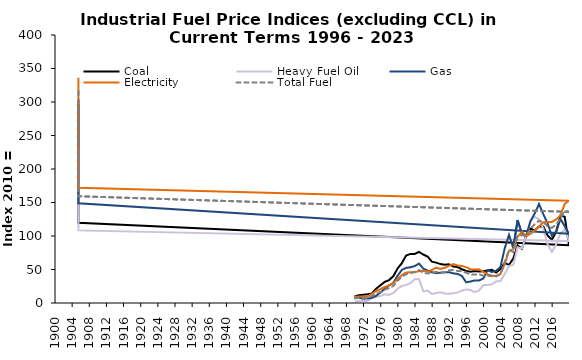
| Category | Coal | Heavy Fuel Oil | Gas | Electricity | Total Fuel |
|---|---|---|---|---|---|
| 1970-01-01 | 9.713 | 2.134 | 10.428 | 8.697 | 6.952 |
| 1971-01-01 | 11.596 | 3.2 | 7.943 | 9.622 | 7.674 |
| 1972-01-01 | 12.482 | 3.056 | 6.341 | 9.833 | 7.6 |
| 1973-01-01 | 13.058 | 2.989 | 6.703 | 9.891 | 7.632 |
| 1974-01-01 | 14.21 | 7.082 | 7.73 | 13.498 | 10.166 |
| 1975-01-01 | 21.309 | 8.917 | 10.685 | 17.925 | 13.944 |
| 1976-01-01 | 26.382 | 10.214 | 15.564 | 20.728 | 16.604 |
| 1977-01-01 | 31.487 | 12.951 | 21.244 | 23.877 | 19.835 |
| 1978-01-01 | 34.175 | 12.143 | 26.232 | 26.27 | 22.208 |
| 1979-01-01 | 39.781 | 15.083 | 29.92 | 29.193 | 25.305 |
| 1980-01-01 | 51.569 | 21.369 | 40.696 | 35.998 | 33.222 |
| 1981-01-01 | 59.597 | 25.603 | 49.336 | 41.692 | 39.111 |
| 1982-01-01 | 70.766 | 27.047 | 52.441 | 45.673 | 43.072 |
| 1983-01-01 | 73.225 | 29.784 | 53.341 | 45.851 | 44.62 |
| 1984-01-01 | 73.306 | 35.415 | 55.116 | 45.773 | 46.576 |
| 1985-01-01 | 76.186 | 35.914 | 58.84 | 47.566 | 49.308 |
| 1986-01-01 | 72.383 | 17.275 | 51.323 | 48.044 | 44.955 |
| 1987-01-01 | 69.428 | 18.485 | 48.349 | 46.656 | 44.175 |
| 1988-01-01 | 61.673 | 13.644 | 46.023 | 49.18 | 44.548 |
| 1989-01-01 | 60.248 | 14.854 | 44.475 | 52.692 | 46.484 |
| 1990-01-01 | 58.047 | 16.154 | 45.258 | 50.799 | 45.235 |
| 1991-01-01 | 57.179 | 14.19 | 45.693 | 52.483 | 46.145 |
| 1992-01-01 | 57.902 | 13.647 | 45.938 | 55.391 | 48.735 |
| 1993-01-01 | 54.358 | 14.547 | 44.224 | 58.032 | 49.333 |
| 1994-01-01 | 53.707 | 15.74 | 43.327 | 55.927 | 47.913 |
| 1995-01-01 | 50.38 | 18.38 | 40.471 | 55.404 | 47.388 |
| 1996-01-01 | 47.92 | 20.298 | 30.922 | 53.491 | 45.241 |
| 1997-01-01 | 46.799 | 19.419 | 32.026 | 50.442 | 42.46 |
| 1998-01-01 | 47.884 | 16.186 | 33.713 | 49.97 | 42.386 |
| 1999-01-01 | 47.161 | 18.528 | 33.528 | 50.263 | 43.071 |
| 2000-01-01 | 47.233 | 26.822 | 36.486 | 46.602 | 40.724 |
| 2001-01-01 | 48.463 | 26.785 | 48.885 | 42.647 | 41 |
| 2002-01-01 | 49.656 | 28.049 | 46.21 | 41.116 | 39.859 |
| 2003-01-01 | 45.533 | 32.378 | 48.176 | 39.777 | 40.243 |
| 2004-01-01 | 50.705 | 32.603 | 53.654 | 43.374 | 43.355 |
| 2005-01-01 | 59.566 | 43.329 | 81.593 | 58.121 | 60.876 |
| 2006-01-01 | 56.998 | 55.247 | 101.751 | 78.061 | 79.338 |
| 2007-01-01 | 66.221 | 57.205 | 82.05 | 80.127 | 75.973 |
| 2008-01-01 | 85.895 | 83.337 | 123.718 | 98.648 | 101.133 |
| 2009-01-01 | 80.832 | 81.284 | 103.876 | 106.388 | 101.202 |
| 2010-01-01 | 100 | 100 | 100 | 100 | 100 |
| 2011-01-01 | 111.077 | 121.335 | 122.336 | 103.156 | 110.886 |
| 2012-01-01 | 108.452 | 128.808 | 133.467 | 108.393 | 117.421 |
| 2013-01-01 | 114.242 | 124.754 | 147.762 | 114.202 | 122.777 |
| 2014-01-01 | 114.126 | 111.229 | 132.716 | 120.553 | 120.86 |
| 2015-01-01 | 100.81 | 87.568 | 118.962 | 120.815 | 114.504 |
| 2016-01-01 | 94.134 | 76.249 | 99.973 | 121.042 | 112.201 |
| 2017-01-01 | 106.252 | 87.772 | 106.238 | 124.814 | 116.932 |
| 2018-01-01 | 130.606 | 103.545 | 125.459 | 130.72 | 126.576 |
| 2019-01-01 | 128.792 | 109.894 | 114.699 | 148.087 | 137.319 |
| 2020-01-01 | 86.306 | 92.54 | 103.338 | 152.459 | 136.007 |
| 1905-07-13 | 119.824 | 108.383 | 148.781 | 171.857 | 159.285 |
| 1905-07-14 | 234.941 | 186.51 | 260.388 | 246.998 | 241.468 |
| 1905-07-15 | 296.803 | 231.307 | 303.118 | 336.145 | 317.688 |